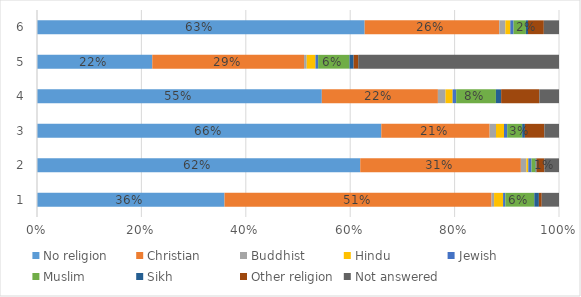
| Category | No religion | Christian | Buddhist | Hindu | Jewish | Muslim | Sikh | Other religion | Not answered |
|---|---|---|---|---|---|---|---|---|---|
| 0 | 0.359 | 0.512 | 0.005 | 0.017 | 0.004 | 0.056 | 0.009 | 0.005 | 0.033 |
| 1 | 0.619 | 0.308 | 0.011 | 0.004 | 0.006 | 0.008 | 0.002 | 0.015 | 0.028 |
| 2 | 0.66 | 0.208 | 0.012 | 0.015 | 0.006 | 0.029 | 0.005 | 0.037 | 0.028 |
| 3 | 0.546 | 0.222 | 0.015 | 0.014 | 0.007 | 0.076 | 0.01 | 0.073 | 0.038 |
| 4 | 0.221 | 0.291 | 0.005 | 0.017 | 0.005 | 0.06 | 0.008 | 0.009 | 0.385 |
| 5 | 0.628 | 0.258 | 0.012 | 0.009 | 0.006 | 0.024 | 0.004 | 0.03 | 0.029 |